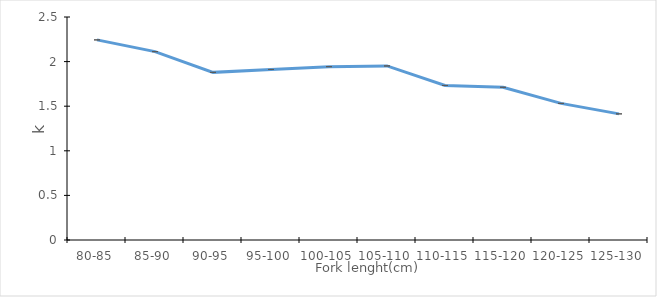
| Category | Series 0 |
|---|---|
| 80-85 | 2.243 |
| 85-90 | 2.112 |
| 90-95 | 1.879 |
| 95-100 | 1.912 |
| 100-105 | 1.943 |
| 105-110 | 1.951 |
| 110-115 | 1.733 |
| 115-120 | 1.712 |
| 120-125 | 1.532 |
| 125-130 | 1.414 |